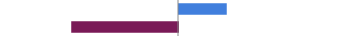
| Category | Series 0 |
|---|---|
| Favorable | 0.27 |
| Unfavorable | -0.603 |